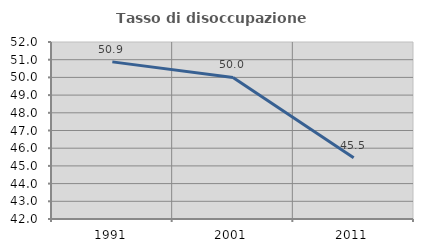
| Category | Tasso di disoccupazione giovanile  |
|---|---|
| 1991.0 | 50.877 |
| 2001.0 | 50 |
| 2011.0 | 45.455 |